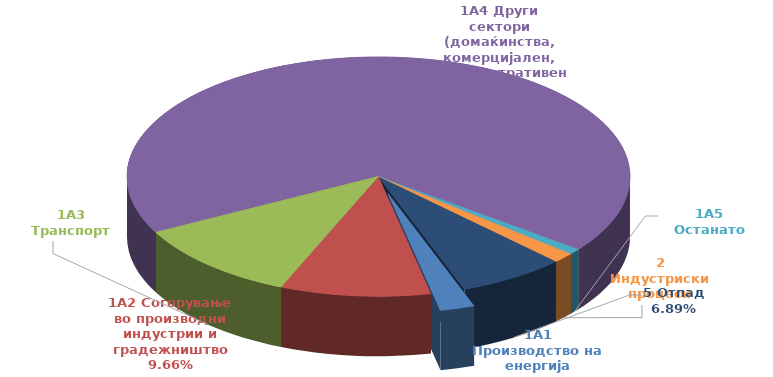
| Category | CO_Emisii |
|---|---|
| 1A1 Производство на енергија | 0.022 |
| 1A2 Согорување во производни индустрии и градежништво | 0.097 |
| 1A3 Транспорт | 0.11 |
| 1A4 Други сектори (домаќинства, комерцијален, административен) | 0.681 |
| 1A5 Останато | 0.008 |
| 2 Индустриски процеси | 0.014 |
| 5 Отпад | 0.069 |